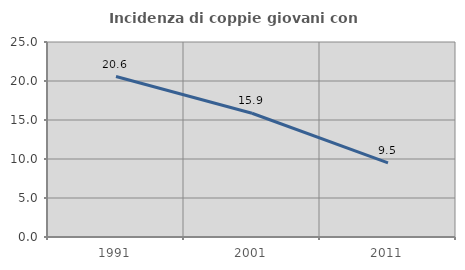
| Category | Incidenza di coppie giovani con figli |
|---|---|
| 1991.0 | 20.572 |
| 2001.0 | 15.868 |
| 2011.0 | 9.505 |